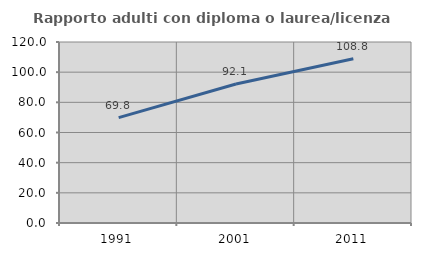
| Category | Rapporto adulti con diploma o laurea/licenza media  |
|---|---|
| 1991.0 | 69.837 |
| 2001.0 | 92.15 |
| 2011.0 | 108.85 |